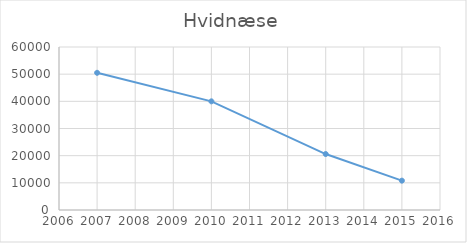
| Category | Series 0 |
|---|---|
| 2007.0 | 50500 |
| 2010.0 | 40000 |
| 2013.0 | 20600 |
| 2015.0 | 10800 |